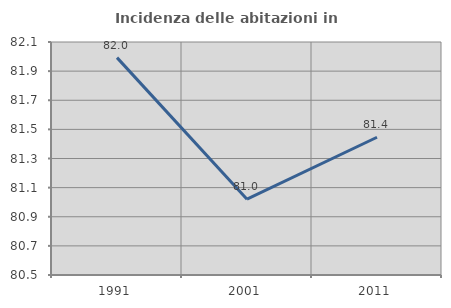
| Category | Incidenza delle abitazioni in proprietà  |
|---|---|
| 1991.0 | 81.993 |
| 2001.0 | 81.021 |
| 2011.0 | 81.446 |